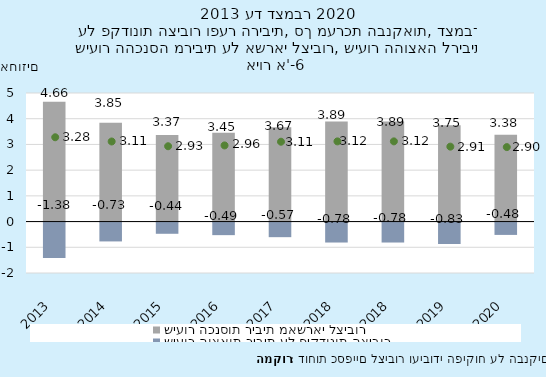
| Category | שיעור הכנסות ריבית מאשראי לציבור | שיעור הוצאות ריבית על פיקדונות הציבור |
|---|---|---|
| 2013-12-31 | 4.656 | -1.377 |
| 2014-12-31 | 3.847 | -0.733 |
| 2015-12-31 | 3.365 | -0.436 |
| 2016-12-31 | 3.45 | -0.489 |
| 2017-12-31 | 3.673 | -0.568 |
| 2018-12-31 | 3.894 | -0.776 |
| 2018-12-31 | 3.894 | -0.776 |
| 2019-12-31 | 3.748 | -0.834 |
| 2020-12-31 | 3.376 | -0.48 |